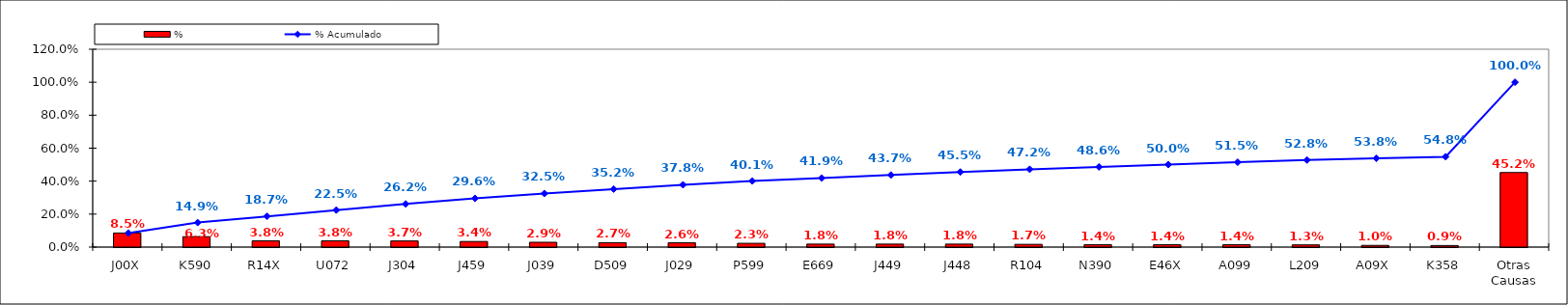
| Category | % |
|---|---|
| J00X | 0.085 |
| K590 | 0.063 |
| R14X | 0.038 |
| U072 | 0.038 |
| J304 | 0.037 |
| J459 | 0.034 |
| J039 | 0.029 |
| D509 | 0.027 |
| J029 | 0.026 |
| P599 | 0.023 |
| E669 | 0.018 |
| J449 | 0.018 |
| J448 | 0.018 |
| R104 | 0.017 |
| N390 | 0.014 |
| E46X | 0.014 |
| A099 | 0.014 |
| L209 | 0.013 |
| A09X | 0.01 |
| K358 | 0.009 |
| Otras Causas | 0.452 |